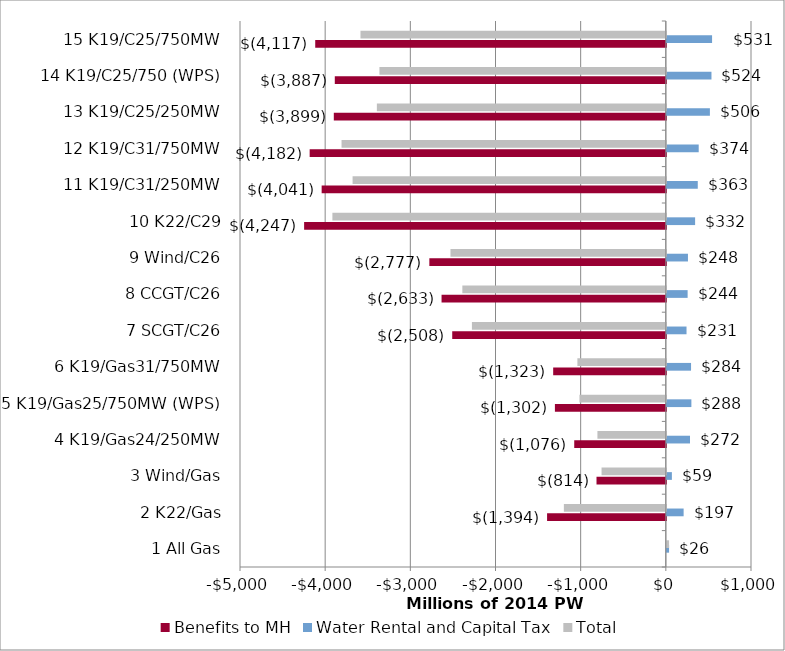
| Category | Benefits to MH | Water Rental and Capital Tax | Total |
|---|---|---|---|
| 1 All Gas | 0 | 26.219 | 26.219 |
| 2 K22/Gas | -1394.422 | 197.138 | -1197.284 |
| 3 Wind/Gas | -813.985 | 59.277 | -754.708 |
| 4 K19/Gas24/250MW | -1075.502 | 272.302 | -803.2 |
| 5 K19/Gas25/750MW (WPS) | -1302.433 | 288.271 | -1014.162 |
| 6 K19/Gas31/750MW | -1322.71 | 284.266 | -1038.445 |
| 7 SCGT/C26 | -2508.13 | 231.184 | -2276.945 |
| 8 CCGT/C26 | -2633.374 | 244.193 | -2389.181 |
| 9 Wind/C26 | -2776.831 | 248.067 | -2528.765 |
| 10 K22/C29 | -4247.133 | 332.045 | -3915.088 |
| 11 K19/C31/250MW | -4041.279 | 363.278 | -3678 |
| 12 K19/C31/750MW | -4182.041 | 374.293 | -3807.748 |
| 13 K19/C25/250MW | -3898.537 | 505.656 | -3392.882 |
| 14 K19/C25/750 (WPS) | -3886.929 | 524.07 | -3362.858 |
| 15 K19/C25/750MW | -4116.685 | 531.203 | -3585.482 |